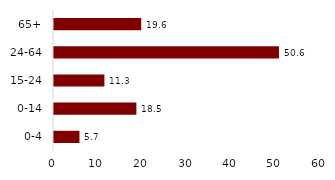
| Category | Series 0 |
|---|---|
| 0-4 | 5.722 |
| 0-14 | 18.515 |
| 15-24 | 11.331 |
| 24-64 | 50.55 |
| 65+ | 19.604 |